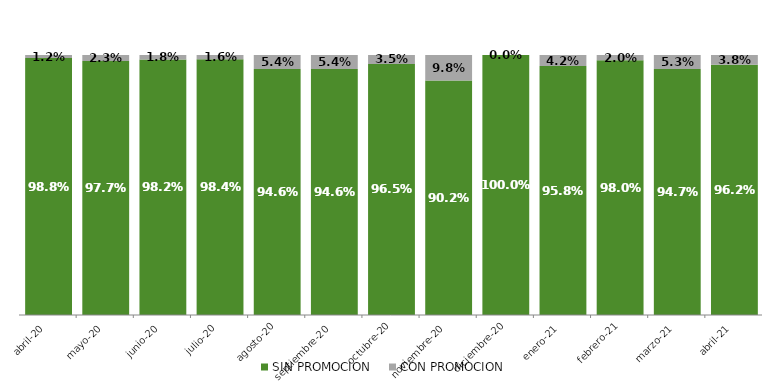
| Category | SIN PROMOCION   | CON PROMOCION   |
|---|---|---|
| 2020-04-01 | 0.988 | 0.012 |
| 2020-05-01 | 0.977 | 0.023 |
| 2020-06-01 | 0.982 | 0.018 |
| 2020-07-01 | 0.984 | 0.016 |
| 2020-08-01 | 0.946 | 0.054 |
| 2020-09-01 | 0.946 | 0.054 |
| 2020-10-01 | 0.965 | 0.035 |
| 2020-11-01 | 0.902 | 0.098 |
| 2020-12-01 | 1 | 0 |
| 2021-01-01 | 0.958 | 0.042 |
| 2021-02-01 | 0.98 | 0.02 |
| 2021-03-01 | 0.947 | 0.053 |
| 2021-04-01 | 0.962 | 0.038 |